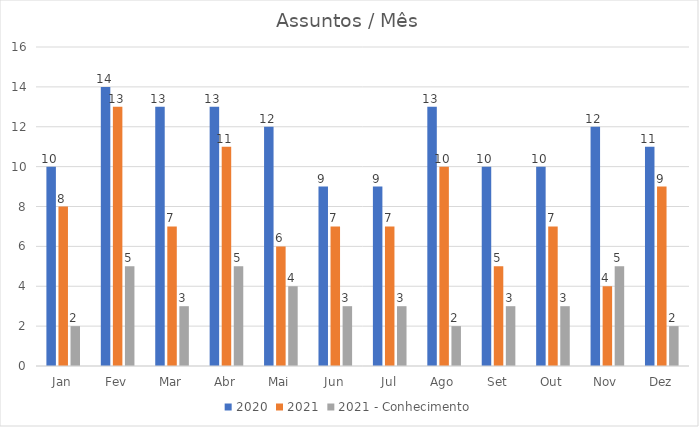
| Category | 2020 | 2021 | 2021 - Conhecimento |
|---|---|---|---|
| Jan | 10 | 8 | 2 |
| Fev | 14 | 13 | 5 |
| Mar | 13 | 7 | 3 |
| Abr | 13 | 11 | 5 |
| Mai | 12 | 6 | 4 |
| Jun | 9 | 7 | 3 |
| Jul | 9 | 7 | 3 |
| Ago | 13 | 10 | 2 |
| Set | 10 | 5 | 3 |
| Out | 10 | 7 | 3 |
| Nov | 12 | 4 | 5 |
| Dez | 11 | 9 | 2 |